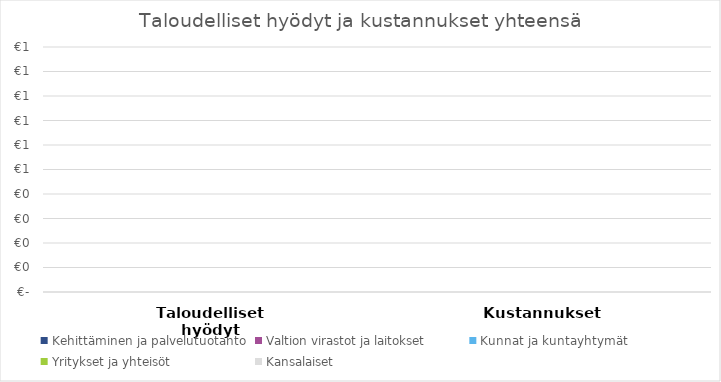
| Category | Kehittäminen ja palvelutuotanto | Valtion virastot ja laitokset | Kunnat ja kuntayhtymät | Yritykset ja yhteisöt | Kansalaiset |
|---|---|---|---|---|---|
| Taloudelliset hyödyt | 0 | 0 | 0 | 0 | 0 |
| Kustannukset | 0 | 0 | 0 | 0 | 0 |